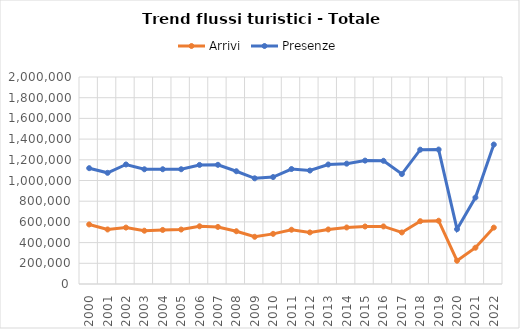
| Category | Arrivi | Presenze |
|---|---|---|
| 2000.0 | 575409 | 1119116 |
| 2001.0 | 526921 | 1074142 |
| 2002.0 | 545215 | 1154736 |
| 2003.0 | 514882 | 1108457 |
| 2004.0 | 522355 | 1108761 |
| 2005.0 | 526266 | 1108841 |
| 2006.0 | 557735 | 1150506 |
| 2007.0 | 551511 | 1151401 |
| 2008.0 | 509709 | 1089411 |
| 2009.0 | 456216 | 1021024 |
| 2010.0 | 484471 | 1033303 |
| 2011.0 | 524391 | 1110833 |
| 2012.0 | 498421 | 1096191 |
| 2013.0 | 526943 | 1154481 |
| 2014.0 | 546203 | 1162771 |
| 2015.0 | 555609 | 1192148 |
| 2016.0 | 556191 | 1190323 |
| 2017.0 | 498122 | 1062408 |
| 2018.0 | 606833 | 1297747 |
| 2019.0 | 611203 | 1299096 |
| 2020.0 | 224773 | 529839 |
| 2021.0 | 350562 | 835018 |
| 2022.0 | 544913 | 1347501 |